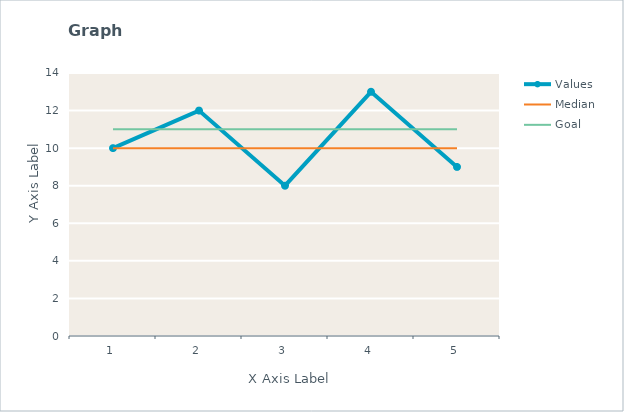
| Category | Values | Median | Goal |
|---|---|---|---|
| 1.0 | 10 | 10 | 11 |
| 2.0 | 12 | 10 | 11 |
| 3.0 | 8 | 10 | 11 |
| 4.0 | 13 | 10 | 11 |
| 5.0 | 9 | 10 | 11 |